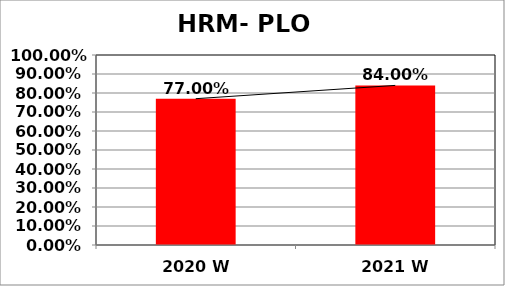
| Category | Series 0 |
|---|---|
| 2020 W | 0.77 |
| 2021 W | 0.84 |